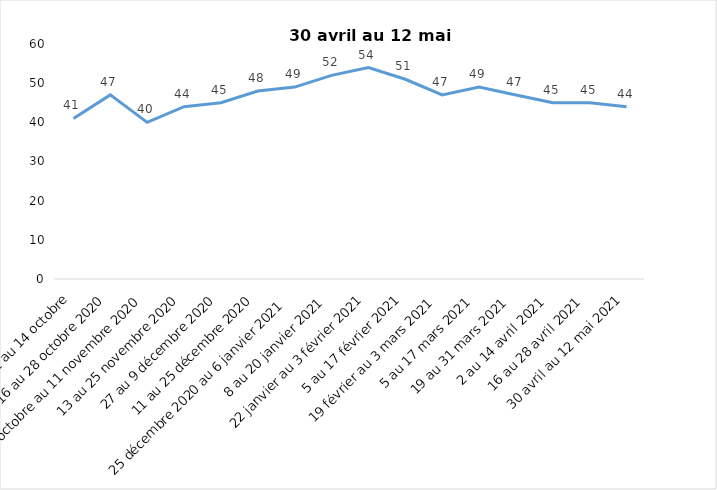
| Category | Toujours aux trois mesures |
|---|---|
| 2 au 14 octobre | 41 |
| 16 au 28 octobre 2020 | 47 |
| 30 octobre au 11 novembre 2020 | 40 |
| 13 au 25 novembre 2020 | 44 |
| 27 au 9 décembre 2020 | 45 |
| 11 au 25 décembre 2020 | 48 |
| 25 décembre 2020 au 6 janvier 2021 | 49 |
| 8 au 20 janvier 2021 | 52 |
| 22 janvier au 3 février 2021 | 54 |
| 5 au 17 février 2021 | 51 |
| 19 février au 3 mars 2021 | 47 |
| 5 au 17 mars 2021 | 49 |
| 19 au 31 mars 2021 | 47 |
| 2 au 14 avril 2021 | 45 |
| 16 au 28 avril 2021 | 45 |
| 30 avril au 12 mai 2021 | 44 |